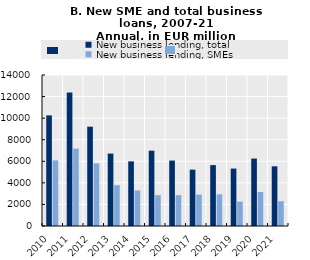
| Category | New business lending, total | New business lending, SMEs |
|---|---|---|
| 2010.0 | 10253.895 | 6086.798 |
| 2011.0 | 12378.017 | 7170.926 |
| 2012.0 | 9207.229 | 5806.205 |
| 2013.0 | 6714.888 | 3783.197 |
| 2014.0 | 5994.158 | 3296.386 |
| 2015.0 | 6983.804 | 2858.734 |
| 2016.0 | 6067.2 | 2859.581 |
| 2017.0 | 5224.989 | 2912.113 |
| 2018.0 | 5646.193 | 2940.059 |
| 2019.0 | 5324.743 | 2257.922 |
| 2020.0 | 6252.609 | 3156.025 |
| 2021.0 | 5532.063 | 2298.556 |